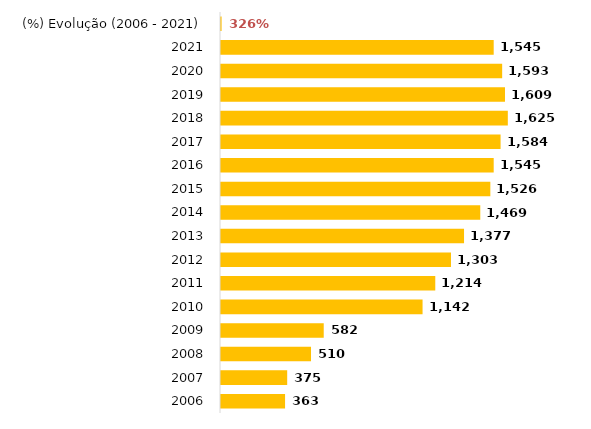
| Category | Total Geral |
|---|---|
| 2006 | 363 |
| 2007 | 375 |
| 2008 | 510 |
| 2009 | 582 |
| 2010 | 1142 |
| 2011 | 1214 |
| 2012 | 1303 |
| 2013 | 1377 |
| 2014 | 1469 |
| 2015 | 1526 |
| 2016 | 1545 |
| 2017 | 1584 |
| 2018 | 1625 |
| 2019 | 1609 |
| 2020 | 1593 |
| 2021 | 1545 |
| (%) Evolução (2006 - 2021) | 3.256 |